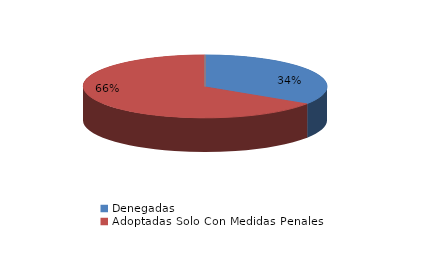
| Category | Series 0 |
|---|---|
| Denegadas | 13 |
| Adoptadas Solo Con Medidas Penales | 25 |
| Adoptadas Con Medidas Civiles Y Penales | 0 |
| Adoptadas Con Medidas Solo Civiles | 0 |